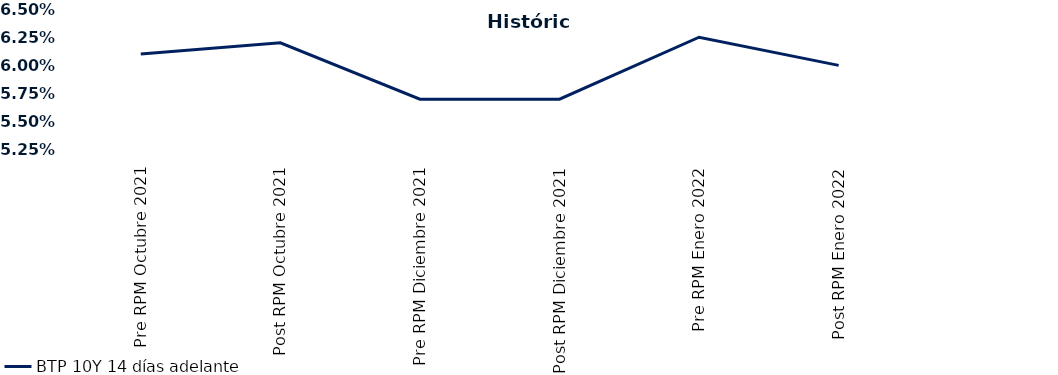
| Category | BTP 10Y 14 días adelante |
|---|---|
| Pre RPM Octubre 2021 | 0.061 |
| Post RPM Octubre 2021 | 0.062 |
| Pre RPM Diciembre 2021 | 0.057 |
| Post RPM Diciembre 2021 | 0.057 |
| Pre RPM Enero 2022 | 0.062 |
| Post RPM Enero 2022 | 0.06 |